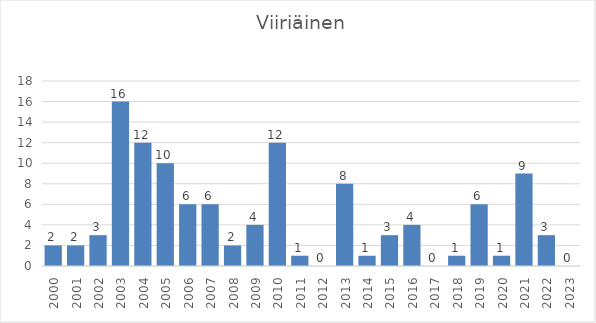
| Category | Series 0 |
|---|---|
| 2000.0 | 2 |
| 2001.0 | 2 |
| 2002.0 | 3 |
| 2003.0 | 16 |
| 2004.0 | 12 |
| 2005.0 | 10 |
| 2006.0 | 6 |
| 2007.0 | 6 |
| 2008.0 | 2 |
| 2009.0 | 4 |
| 2010.0 | 12 |
| 2011.0 | 1 |
| 2012.0 | 0 |
| 2013.0 | 8 |
| 2014.0 | 1 |
| 2015.0 | 3 |
| 2016.0 | 4 |
| 2017.0 | 0 |
| 2018.0 | 1 |
| 2019.0 | 6 |
| 2020.0 | 1 |
| 2021.0 | 9 |
| 2022.0 | 3 |
| 2023.0 | 0 |